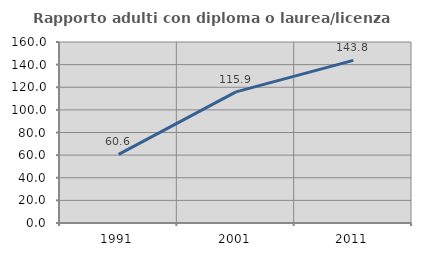
| Category | Rapporto adulti con diploma o laurea/licenza media  |
|---|---|
| 1991.0 | 60.606 |
| 2001.0 | 115.929 |
| 2011.0 | 143.777 |